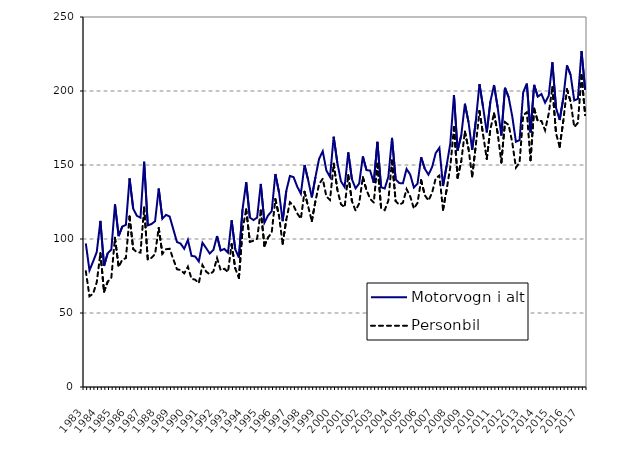
| Category | Motorvogn i alt | Personbil |
|---|---|---|
| 1983.0 | 97 | 78.3 |
| nan | 78.8 | 61.3 |
| nan | 84.8 | 63 |
| nan | 91.2 | 70.8 |
| 1984.0 | 112.2 | 90.4 |
| nan | 81.8 | 64.4 |
| nan | 90.4 | 71.1 |
| nan | 92.9 | 73.9 |
| 1985.0 | 123.4 | 100.8 |
| nan | 102 | 81.1 |
| nan | 108.4 | 86 |
| nan | 109.6 | 87.1 |
| 1986.0 | 141 | 115.2 |
| nan | 120.5 | 93.2 |
| nan | 115.7 | 91.1 |
| nan | 114.4 | 90.8 |
| 1987.0 | 152.2 | 121.3 |
| nan | 109.2 | 86.1 |
| nan | 110.1 | 87.3 |
| nan | 112 | 89.8 |
| 1988.0 | 134.1 | 107.5 |
| nan | 113.7 | 90 |
| nan | 116.3 | 93.1 |
| nan | 115.2 | 93.4 |
| 1989.0 | 106.6 | 86.4 |
| nan | 98 | 79.6 |
| nan | 96.9 | 79 |
| nan | 93.4 | 76.8 |
| 1990.0 | 99.4 | 81.3 |
| nan | 88.6 | 73.1 |
| nan | 88.2 | 72.5 |
| nan | 84.8 | 70.2 |
| 1991.0 | 97.5 | 82.4 |
| nan | 93.9 | 78 |
| nan | 90.2 | 76.1 |
| nan | 92.6 | 78.1 |
| 1992.0 | 102 | 87.1 |
| nan | 92.2 | 78.9 |
| nan | 93.3 | 79.9 |
| nan | 90.8 | 77.6 |
| 1993.0 | 112.6 | 96.5 |
| nan | 93 | 80.1 |
| nan | 87.5 | 73.6 |
| nan | 120.1 | 106.6 |
| 1994.0 | 138.4 | 120 |
| nan | 114.5 | 98.1 |
| nan | 112.8 | 98.8 |
| nan | 114.5 | 100.2 |
| 1995.0 | 137.2 | 119.3 |
| nan | 111 | 95.4 |
| nan | 115.9 | 101 |
| nan | 118.8 | 104.4 |
| 1996.0 | 143.9 | 126.9 |
| nan | 131.6 | 115.7 |
| nan | 112 | 96.7 |
| nan | 132.5 | 113.1 |
| 1997.0 | 142.6 | 124.8 |
| nan | 141.8 | 122.5 |
| nan | 135.4 | 117.3 |
| nan | 130.6 | 113.7 |
| 1998.0 | 150 | 131.9 |
| nan | 139.8 | 122 |
| nan | 128.1 | 112.1 |
| nan | 141.8 | 125.6 |
| 1999.0 | 154.2 | 137.1 |
| nan | 159.3 | 140.7 |
| nan | 146.3 | 128.7 |
| nan | 141.9 | 126.4 |
| 2000.0 | 169.1 | 150.9 |
| nan | 151.5 | 133.4 |
| nan | 139 | 123.5 |
| nan | 135.1 | 121.4 |
| 2001.0 | 158.5 | 143.1 |
| nan | 140.46 | 125.7 |
| nan | 134.24 | 119.2 |
| nan | 137.495 | 124.072 |
| 2002.0 | 155.814 | 141.724 |
| nan | 146.543 | 133.19 |
| nan | 146.231 | 127.141 |
| nan | 137.967 | 124.641 |
| 2003.0 | 165.679 | 150.811 |
| nan | 135.021 | 121.101 |
| nan | 134.111 | 119.491 |
| nan | 142.013 | 125.959 |
| 2004.0 | 168.309 | 153.043 |
| nan | 140.267 | 125.568 |
| nan | 137.77 | 123.121 |
| nan | 137.685 | 124.506 |
| 2005.0 | 147.311 | 133.756 |
| nan | 143.517 | 128.79 |
| nan | 134.783 | 120.571 |
| nan | 137.37 | 124.382 |
| 2006.0 | 155.213 | 139.728 |
| nan | 147.444 | 129.572 |
| nan | 143.451 | 126.006 |
| nan | 148.561 | 131.195 |
| 2007.0 | 158.1 | 141.084 |
| nan | 161.613 | 142.897 |
| nan | 135.821 | 119.753 |
| nan | 149.791 | 133.498 |
| 2008.0 | 164.642 | 148.614 |
| nan | 197.287 | 175.714 |
| nan | 159.718 | 141.407 |
| nan | 170.057 | 152.54 |
| 2009.0 | 191.38 | 172.559 |
| nan | 178.906 | 160.765 |
| nan | 160.234 | 142.312 |
| nan | 179.857 | 163.532 |
| 2010.0 | 204.636 | 186.507 |
| nan | 188.957 | 170.463 |
| nan | 172.077 | 154.156 |
| nan | 192.961 | 174.399 |
| 2011.0 | 204.005 | 184.86 |
| nan | 188.741 | 171.333 |
| nan | 169.934 | 151.694 |
| nan | 202.176 | 178.919 |
| 2012.0 | 195.829 | 177.072 |
| nan | 182.751 | 165.128 |
| nan | 165.73 | 148.242 |
| nan | 166.805 | 151.728 |
| 2013.0 | 199.181 | 183.653 |
| nan | 205.015 | 185.634 |
| nan | 172.044 | 153.21 |
| nan | 204.1 | 188.079 |
| 2014.0 | 196.177 | 179.552 |
| nan | 197.965 | 179.767 |
| nan | 192.105 | 173.474 |
| nan | 196.809 | 184.739 |
| 2015.0 | 219.419 | 202.592 |
| nan | 188.696 | 171.451 |
| nan | 180.388 | 162.297 |
| nan | 195.23 | 179.891 |
| 2016.0 | 217.298 | 201.197 |
| nan | 210.949 | 192.893 |
| nan | 193.648 | 175.642 |
| nan | 194.663 | 178.455 |
| 2017.0 | 227.029 | 210.738 |
| nan | 200.767 | 183.708 |